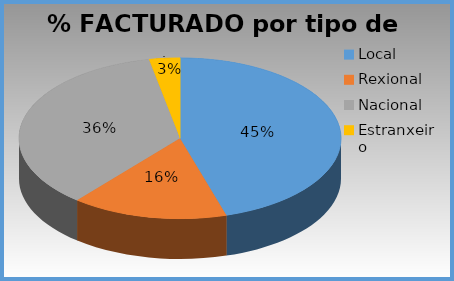
| Category | % facturado |
|---|---|
| Local | 0.453 |
| Rexional | 0.157 |
| Nacional | 0.359 |
| Estranxeiro | 0.031 |